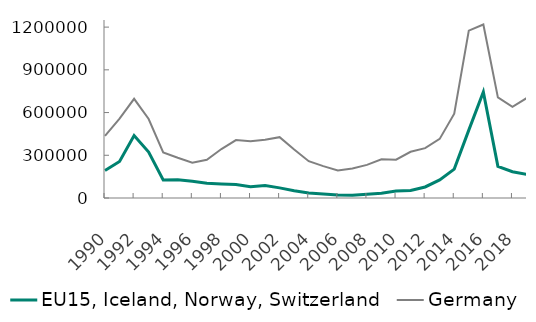
| Category | EU15, Iceland, Norway, Switzerland | Germany |
|---|---|---|
| 1990 | 193065 | 436560 |
| 1991 | 256110 | 557015 |
| 1992 | 438190 | 696575 |
| 1993 | 322600 | 554815 |
| 1994 | 127210 | 319590 |
| 1995 | 127935 | 282275 |
| 1996 | 117335 | 248000 |
| 1997 | 104355 | 268845 |
| 1998 | 98645 | 343765 |
| 1999 | 94775 | 406895 |
| 2000 | 78565 | 398840 |
| 2001 | 88285 | 409620 |
| 2002 | 71125 | 427335 |
| 2003 | 50565 | 340925 |
| 2004 | 35605 | 258405 |
| 2005 | 28915 | 223775 |
| 2006 | 21030 | 192820 |
| 2007 | 19165 | 207135 |
| 2008 | 26845 | 232605 |
| 2009 | 32910 | 271460 |
| 2010 | 48475 | 269125 |
| 2011 | 53235 | 324350 |
| 2012 | 77485 | 350270 |
| 2013 | 126705 | 415000 |
| 2014 | 202645 | 592310 |
| 2015 | 476510 | 1175480 |
| 2016 | 745155 | 1218655 |
| 2017 | 222560 | 706305 |
| 2018 | 184180 | 640190 |
| 2019 | 165615 | 703035 |